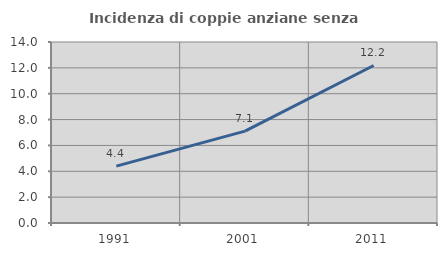
| Category | Incidenza di coppie anziane senza figli  |
|---|---|
| 1991.0 | 4.403 |
| 2001.0 | 7.104 |
| 2011.0 | 12.183 |